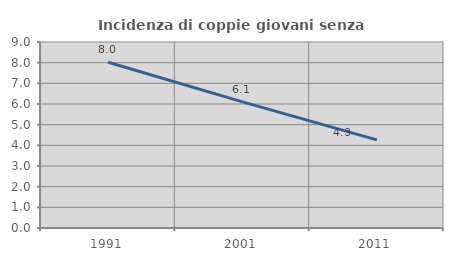
| Category | Incidenza di coppie giovani senza figli |
|---|---|
| 1991.0 | 8.021 |
| 2001.0 | 6.103 |
| 2011.0 | 4.264 |